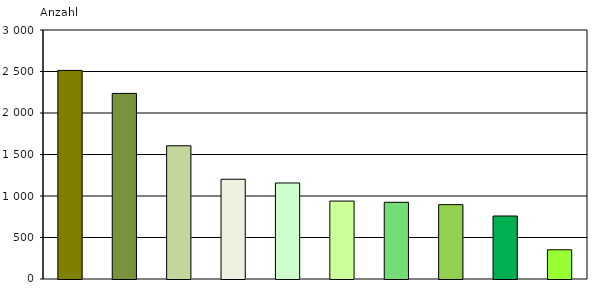
| Category | Series 0 |
|---|---|
| eingeschränkte Erziehungskompetenz der Eltern/Personensorgeberechtigten | 2513 |
| Belastungen des jungen Menschen durch familiäre Konflikte | 2236 |
| Entwicklungsauffälligkeiten/seelische Probleme des jungen Menschen | 1605 |
| Unversorgtheit des jungen Menschen  | 1202 |
| Gefährdung des Kindeswohls | 1157 |
| unzureichende Förderung/Betreuung/Versorgung des jungen Menschen in der Familie | 939 |
| Belastungen des jungen Menschen durch Problemlagen der Eltern | 924 |
| Auffälligkeiten im sozialen Verhalten (dissoziales Verhalten) des jungen Menschen | 896 |
| schulische/berufliche Probleme des jungen Menschen | 759 |
| Übernahme von einem anderen Jugendamt wegen Zuständigkeitswechsel | 352 |